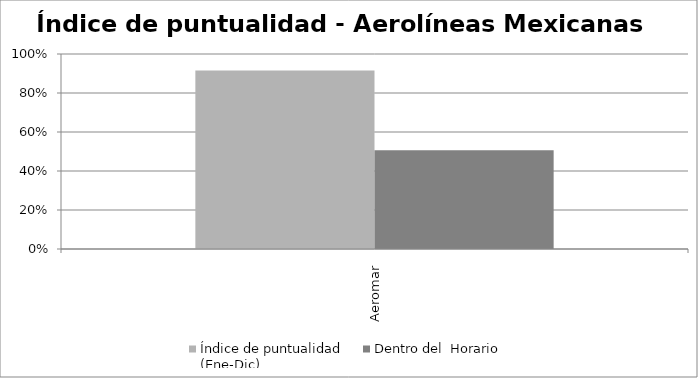
| Category | Índice de puntualidad
(Ene-Dic) | Dentro del  Horario |
|---|---|---|
| Aeromar | 0.916 | 0.507 |